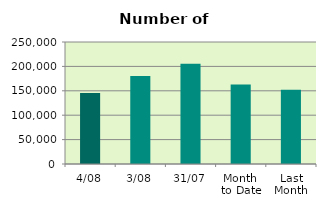
| Category | Series 0 |
|---|---|
| 4/08 | 145728 |
| 3/08 | 180200 |
| 31/07 | 205536 |
| Month 
to Date | 162964 |
| Last
Month | 152026.87 |